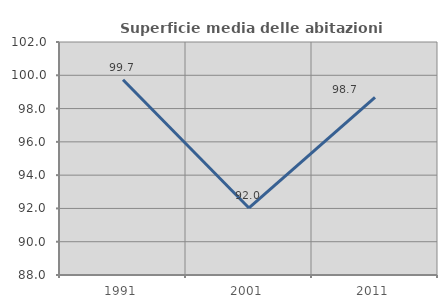
| Category | Superficie media delle abitazioni occupate |
|---|---|
| 1991.0 | 99.731 |
| 2001.0 | 92.026 |
| 2011.0 | 98.68 |